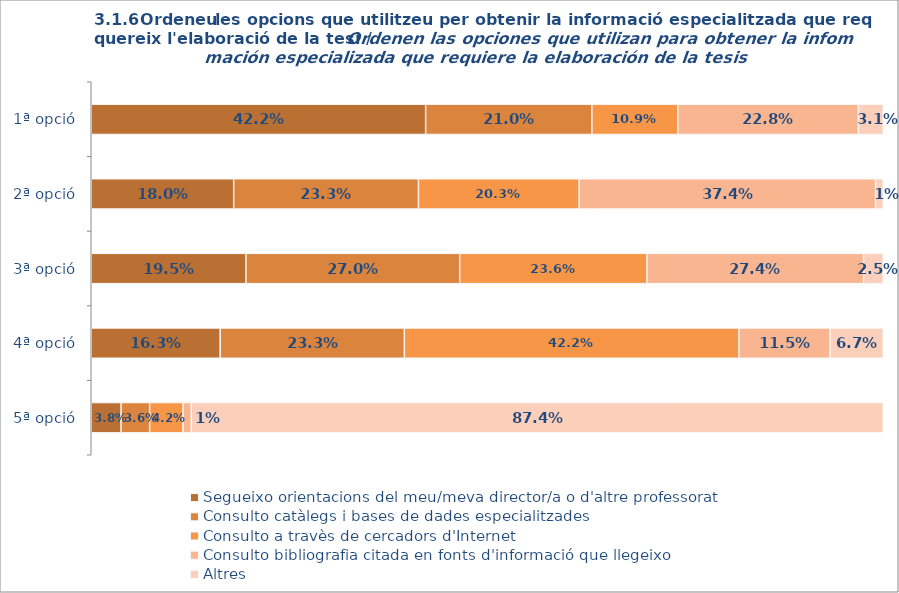
| Category | Segueixo orientacions del meu/meva director/a o d'altre professorat | Consulto catàlegs i bases de dades especialitzades | Consulto a travès de cercadors d'Internet | Consulto bibliografia citada en fonts d'informació que llegeixo | Altres |
|---|---|---|---|---|---|
| 1ª opció | 0.422 | 0.21 | 0.109 | 0.228 | 0.031 |
| 2ª opció | 0.18 | 0.233 | 0.203 | 0.374 | 0.01 |
| 3ª opció | 0.195 | 0.27 | 0.236 | 0.274 | 0.025 |
| 4ª opció | 0.163 | 0.233 | 0.422 | 0.115 | 0.067 |
| 5ª opció | 0.038 | 0.036 | 0.042 | 0.011 | 0.874 |